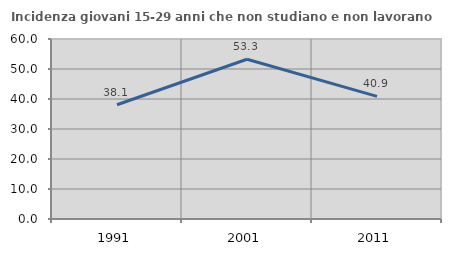
| Category | Incidenza giovani 15-29 anni che non studiano e non lavorano  |
|---|---|
| 1991.0 | 38.076 |
| 2001.0 | 53.253 |
| 2011.0 | 40.889 |